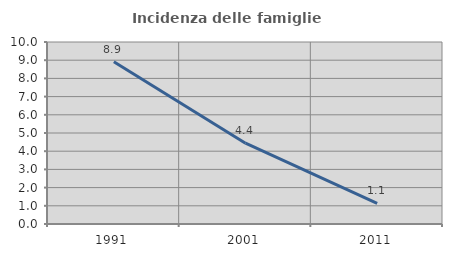
| Category | Incidenza delle famiglie numerose |
|---|---|
| 1991.0 | 8.92 |
| 2001.0 | 4.44 |
| 2011.0 | 1.132 |